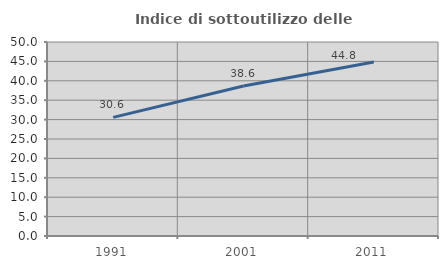
| Category | Indice di sottoutilizzo delle abitazioni  |
|---|---|
| 1991.0 | 30.583 |
| 2001.0 | 38.647 |
| 2011.0 | 44.828 |